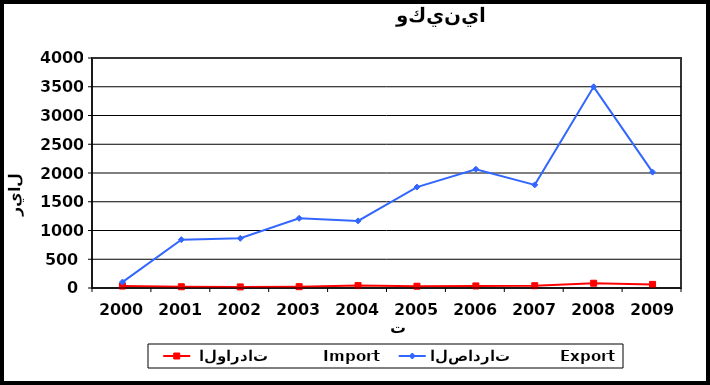
| Category |  الواردات           Import | الصادرات          Export |
|---|---|---|
| 2000.0 | 34 | 103 |
| 2001.0 | 22 | 841 |
| 2002.0 | 19 | 864 |
| 2003.0 | 23 | 1212 |
| 2004.0 | 42 | 1167 |
| 2005.0 | 31 | 1755 |
| 2006.0 | 36 | 2066 |
| 2007.0 | 40 | 1794 |
| 2008.0 | 83 | 3499 |
| 2009.0 | 63 | 2015 |